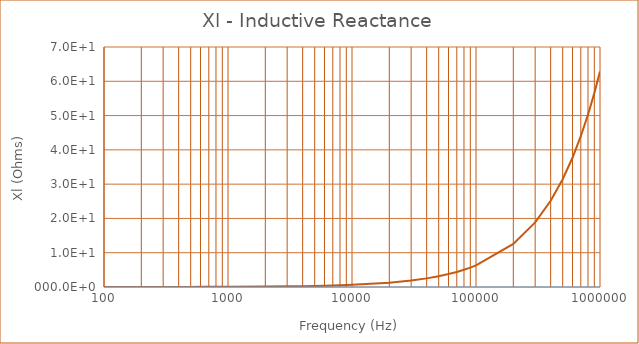
| Category | Series 0 |
|---|---|
| 100.0 | 0.006 |
| 200.0 | 0.013 |
| 300.0 | 0.019 |
| 400.0 | 0.025 |
| 500.0 | 0.031 |
| 600.0 | 0.038 |
| 700.0 | 0.044 |
| 800.0 | 0.05 |
| 900.0 | 0.057 |
| 1000.0 | 0.063 |
| 2000.0 | 0.126 |
| 3000.0 | 0.188 |
| 4000.0 | 0.251 |
| 5000.0 | 0.314 |
| 6000.0 | 0.377 |
| 7000.0 | 0.44 |
| 8000.0 | 0.503 |
| 9000.0 | 0.565 |
| 10000.0 | 0.628 |
| 20000.0 | 1.257 |
| 30000.0 | 1.885 |
| 40000.0 | 2.513 |
| 50000.0 | 3.142 |
| 60000.0 | 3.77 |
| 70000.0 | 4.398 |
| 80000.0 | 5.027 |
| 90000.0 | 5.655 |
| 100000.0 | 6.283 |
| 200000.0 | 12.566 |
| 300000.0 | 18.85 |
| 400000.0 | 25.133 |
| 500000.0 | 31.416 |
| 600000.0 | 37.699 |
| 700000.0 | 43.982 |
| 800000.0 | 50.265 |
| 900000.0 | 56.549 |
| 1000000.0 | 62.832 |